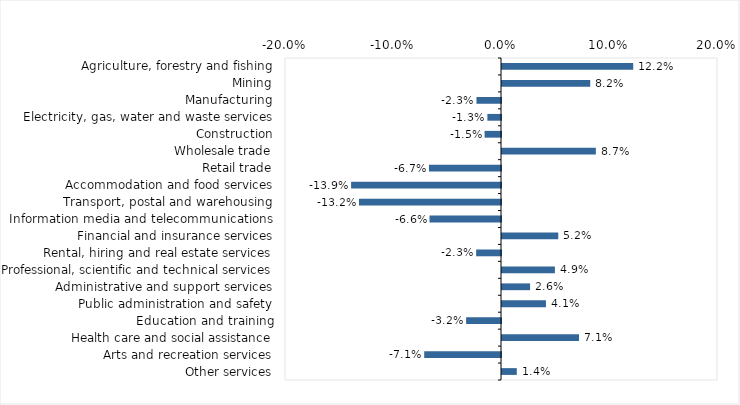
| Category | This week |
|---|---|
| Agriculture, forestry and fishing | 0.122 |
| Mining | 0.082 |
| Manufacturing | -0.023 |
| Electricity, gas, water and waste services | -0.013 |
| Construction | -0.015 |
| Wholesale trade | 0.087 |
| Retail trade | -0.067 |
| Accommodation and food services | -0.139 |
| Transport, postal and warehousing | -0.132 |
| Information media and telecommunications | -0.066 |
| Financial and insurance services | 0.052 |
| Rental, hiring and real estate services | -0.023 |
| Professional, scientific and technical services | 0.049 |
| Administrative and support services | 0.026 |
| Public administration and safety | 0.041 |
| Education and training | -0.032 |
| Health care and social assistance | 0.071 |
| Arts and recreation services | -0.071 |
| Other services | 0.014 |